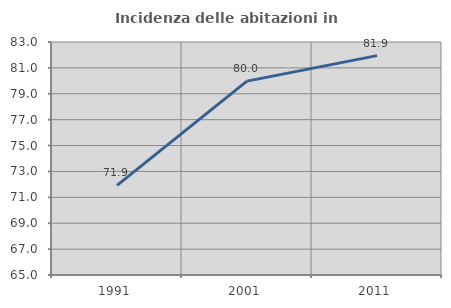
| Category | Incidenza delle abitazioni in proprietà  |
|---|---|
| 1991.0 | 71.928 |
| 2001.0 | 79.975 |
| 2011.0 | 81.949 |